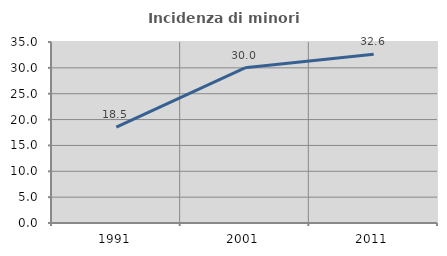
| Category | Incidenza di minori stranieri |
|---|---|
| 1991.0 | 18.519 |
| 2001.0 | 30 |
| 2011.0 | 32.622 |